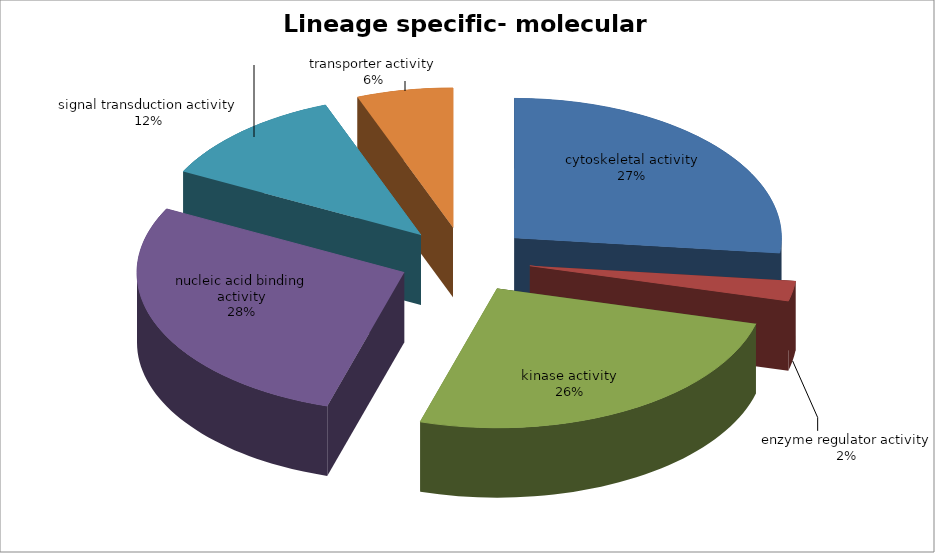
| Category | Series 0 |
|---|---|
| cytoskeletal activity | 23 |
| enzyme regulator activity | 2 |
| kinase activity | 22 |
| nucleic acid binding activity | 24 |
| signal transduction activity | 10 |
| transporter activity | 5 |